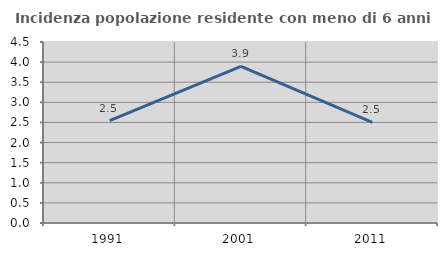
| Category | Incidenza popolazione residente con meno di 6 anni |
|---|---|
| 1991.0 | 2.547 |
| 2001.0 | 3.894 |
| 2011.0 | 2.5 |